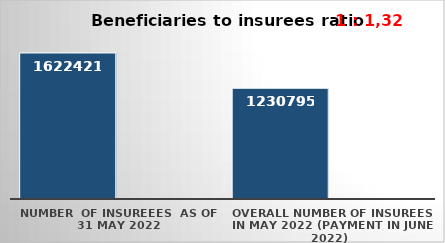
| Category | Series 0 | Series 1 |
|---|---|---|
| NUMBER  of insureees  as of  31 May 2022 | 1622421 |  |
| OVERALL number of insurees in May 2022 (payment in June 2022) | 1230795 |  |